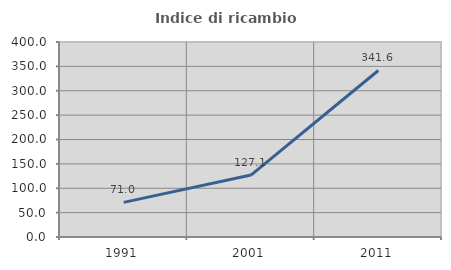
| Category | Indice di ricambio occupazionale  |
|---|---|
| 1991.0 | 70.968 |
| 2001.0 | 127.074 |
| 2011.0 | 341.606 |